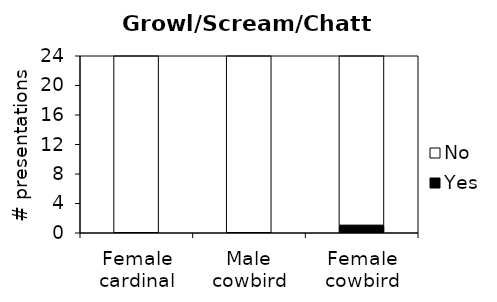
| Category | Yes | No |
|---|---|---|
| Female cardinal | 0 | 24 |
| Male cowbird | 0 | 24 |
| Female cowbird | 1 | 23 |